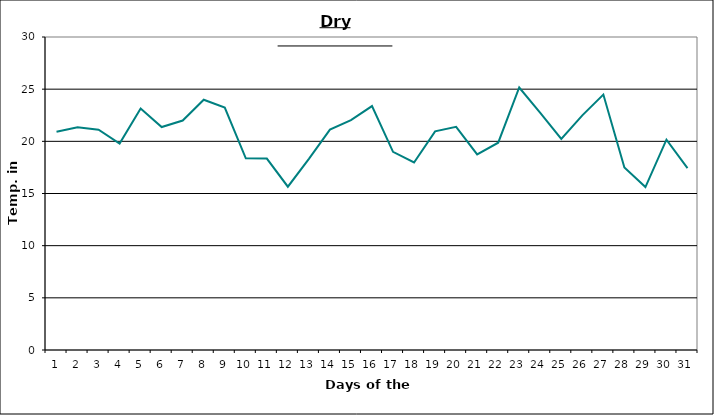
| Category | Series 0 |
|---|---|
| 0 | 20.91 |
| 1 | 21.35 |
| 2 | 21.11 |
| 3 | 19.79 |
| 4 | 23.14 |
| 5 | 21.37 |
| 6 | 21.99 |
| 7 | 23.99 |
| 8 | 23.23 |
| 9 | 18.37 |
| 10 | 18.35 |
| 11 | 15.65 |
| 12 | 18.32 |
| 13 | 21.13 |
| 14 | 22.04 |
| 15 | 23.38 |
| 16 | 18.99 |
| 17 | 17.97 |
| 18 | 20.96 |
| 19 | 21.39 |
| 20 | 18.74 |
| 21 | 19.87 |
| 22 | 25.16 |
| 23 | 22.73 |
| 24 | 20.23 |
| 25 | 22.49 |
| 26 | 24.48 |
| 27 | 17.49 |
| 28 | 15.62 |
| 29 | 20.16 |
| 30 | 17.44 |